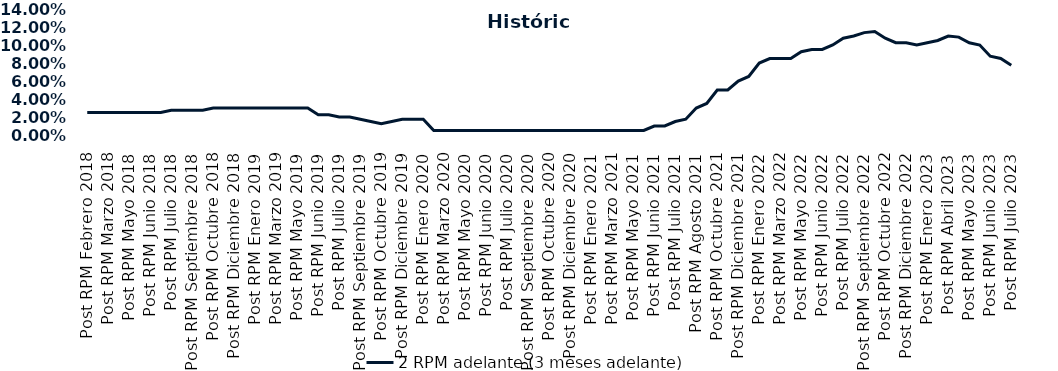
| Category | 2 RPM adelante (3 meses adelante) |
|---|---|
| Post RPM Febrero 2018 | 0.025 |
| Pre RPM Marzo 2018 | 0.025 |
| Post RPM Marzo 2018 | 0.025 |
| Pre RPM Mayo 2018 | 0.025 |
| Post RPM Mayo 2018 | 0.025 |
| Pre RPM Junio 2018 | 0.025 |
| Post RPM Junio 2018 | 0.025 |
| Pre RPM Julio 2018 | 0.025 |
| Post RPM Julio 2018 | 0.028 |
| Pre RPM Septiembre 2018 | 0.028 |
| Post RPM Septiembre 2018 | 0.028 |
| Pre RPM Octubre 2018 | 0.028 |
| Post RPM Octubre 2018 | 0.03 |
| Pre RPM Diciembre 2018 | 0.03 |
| Post RPM Diciembre 2018 | 0.03 |
| Pre RPM Enero 2019 | 0.03 |
| Post RPM Enero 2019 | 0.03 |
| Pre RPM Marzo 2019 | 0.03 |
| Post RPM Marzo 2019 | 0.03 |
| Pre RPM Mayo 2019 | 0.03 |
| Post RPM Mayo 2019 | 0.03 |
| Pre RPM Junio 2019 | 0.03 |
| Post RPM Junio 2019 | 0.022 |
| Pre RPM Julio 2019 | 0.022 |
| Post RPM Julio 2019 | 0.02 |
| Pre RPM Septiembre 2019 | 0.02 |
| Post RPM Septiembre 2019 | 0.018 |
| Pre RPM Octubre 2019 | 0.015 |
| Post RPM Octubre 2019 | 0.012 |
| Pre RPM Diciembre 2019 | 0.015 |
| Post RPM Diciembre 2019 | 0.018 |
| Pre RPM Enero 2020 | 0.018 |
| Post RPM Enero 2020 | 0.018 |
| Pre RPM Marzo 2020 | 0.005 |
| Post RPM Marzo 2020 | 0.005 |
| Pre RPM Mayo 2020 | 0.005 |
| Post RPM Mayo 2020 | 0.005 |
| Pre RPM Junio 2020 | 0.005 |
| Post RPM Junio 2020 | 0.005 |
| Pre RPM Julio 2020 | 0.005 |
| Post RPM Julio 2020 | 0.005 |
| Pre RPM Septiembre 2020 | 0.005 |
| Post RPM Septiembre 2020 | 0.005 |
| Pre RPM Octubre 2020 | 0.005 |
| Post RPM Octubre 2020 | 0.005 |
| Pre RPM Diciembre 2020 | 0.005 |
| Post RPM Diciembre 2020 | 0.005 |
| Pre RPM Enero 2021 | 0.005 |
| Post RPM Enero 2021 | 0.005 |
| Pre RPM Marzo 2021 | 0.005 |
| Post RPM Marzo 2021 | 0.005 |
| Pre RPM Mayo 2021 | 0.005 |
| Post RPM Mayo 2021 | 0.005 |
| Pre RPM Junio 2021 | 0.005 |
| Post RPM Junio 2021 | 0.01 |
| Pre RPM Julio 2021 | 0.01 |
| Post RPM Julio 2021 | 0.015 |
| Pre RPM Agosto 2021 | 0.018 |
| Post RPM Agosto 2021 | 0.03 |
| Pre RPM Octubre 2021 | 0.035 |
| Post RPM Octubre 2021 | 0.05 |
| Pre RPM Diciembre 2021 | 0.05 |
| Post RPM Diciembre 2021 | 0.06 |
| Pre RPM Enero 2022 | 0.065 |
| Post RPM Enero 2022 | 0.08 |
| Pre RPM Marzo 2022 | 0.085 |
| Post RPM Marzo 2022 | 0.085 |
| Pre RPM Mayo 2022 | 0.085 |
| Post RPM Mayo 2022 | 0.092 |
| Pre RPM Junio 2022 | 0.095 |
| Post RPM Junio 2022 | 0.095 |
| Pre RPM Julio 2022 | 0.1 |
| Post RPM Julio 2022 | 0.108 |
| Pre RPM Septiembre 2022 | 0.11 |
| Post RPM Septiembre 2022 | 0.114 |
| Pre RPM Octubre 2022 | 0.115 |
| Post RPM Octubre 2022 | 0.108 |
| Pre RPM Diciembre 2022 | 0.102 |
| Post RPM Diciembre 2022 | 0.102 |
| Pre RPM Enero 2023 | 0.1 |
| Post RPM Enero 2023 | 0.102 |
| Pre RPM Abril 2023 | 0.105 |
| Post RPM Abril 2023 | 0.11 |
| Pre RPM Mayo 2023 | 0.109 |
| Post RPM Mayo 2023 | 0.102 |
| Pre RPM Junio 2023 | 0.1 |
| Post RPM Junio 2023 | 0.088 |
| Pre RPM Julio 2023 | 0.085 |
| Post RPM Julio 2023 | 0.078 |